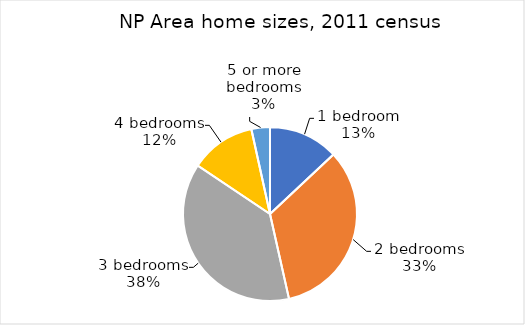
| Category | Series 0 |
|---|---|
| 1 bedroom | 0.13 |
| 2 bedrooms | 0.335 |
| 3 bedrooms | 0.379 |
| 4 bedrooms | 0.122 |
| 5 or more bedrooms | 0.034 |